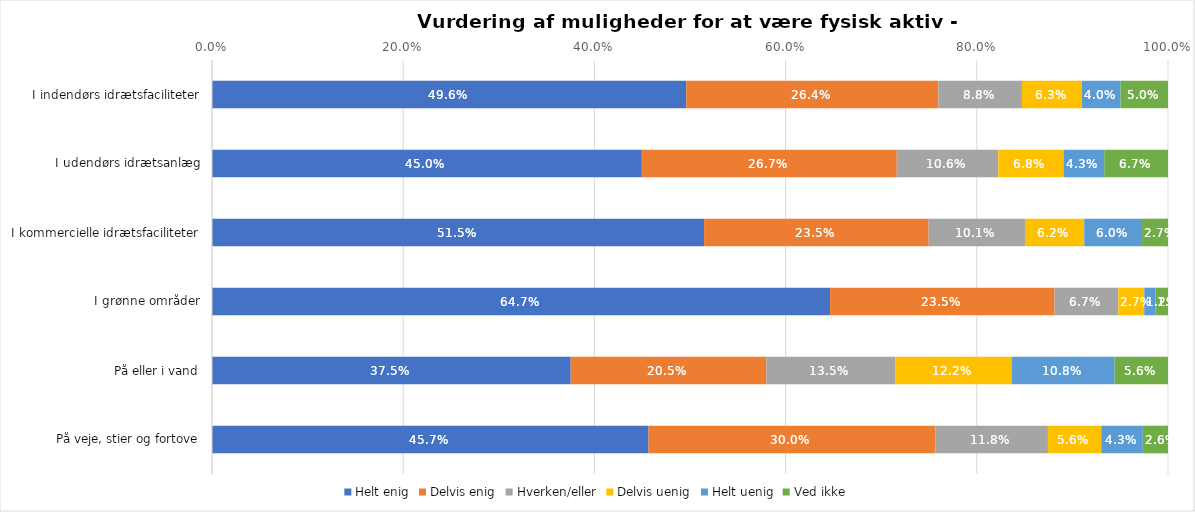
| Category | Helt enig | Delvis enig | Hverken/eller | Delvis uenig | Helt uenig | Ved ikke |
|---|---|---|---|---|---|---|
| I indendørs idrætsfaciliteter | 0.496 | 0.264 | 0.088 | 0.063 | 0.04 | 0.05 |
| I udendørs idrætsanlæg | 0.45 | 0.267 | 0.106 | 0.068 | 0.043 | 0.067 |
| I kommercielle idrætsfaciliteter | 0.515 | 0.235 | 0.101 | 0.062 | 0.06 | 0.027 |
| I grønne områder | 0.647 | 0.235 | 0.067 | 0.027 | 0.012 | 0.013 |
| På eller i vand | 0.375 | 0.205 | 0.135 | 0.122 | 0.108 | 0.056 |
| På veje, stier og fortove | 0.457 | 0.3 | 0.118 | 0.056 | 0.043 | 0.026 |